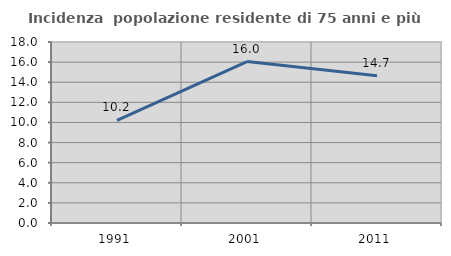
| Category | Incidenza  popolazione residente di 75 anni e più |
|---|---|
| 1991.0 | 10.211 |
| 2001.0 | 16.049 |
| 2011.0 | 14.653 |